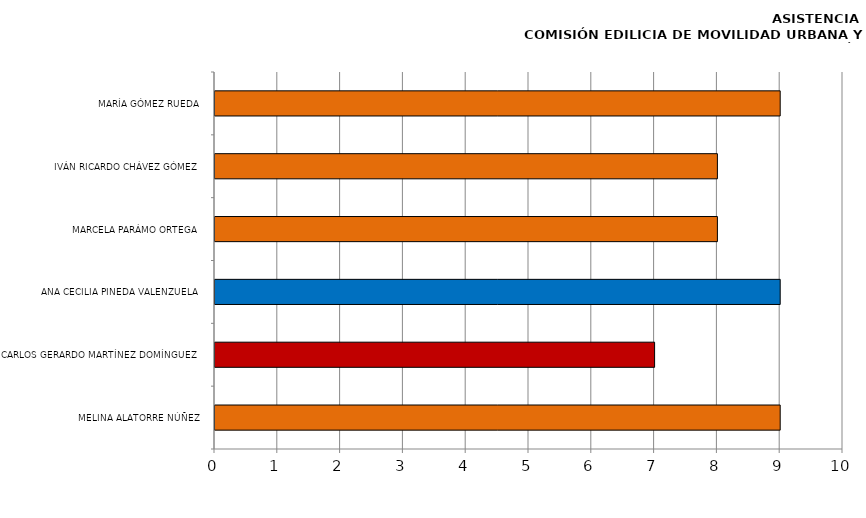
| Category | Series 0 |
|---|---|
| MELINA ALATORRE NÚÑEZ | 9 |
| CARLOS GERARDO MARTÍNEZ DOMÍNGUEZ | 7 |
| ANA CECILIA PINEDA VALENZUELA | 9 |
| MARCELA PARÁMO ORTEGA | 8 |
| IVÁN RICARDO CHÁVEZ GÓMEZ | 8 |
| MARÍA GÓMEZ RUEDA | 9 |